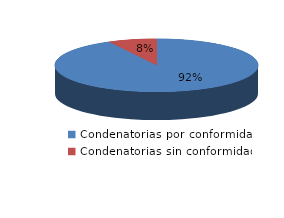
| Category | Series 0 |
|---|---|
| 0 | 993 |
| 1 | 83 |